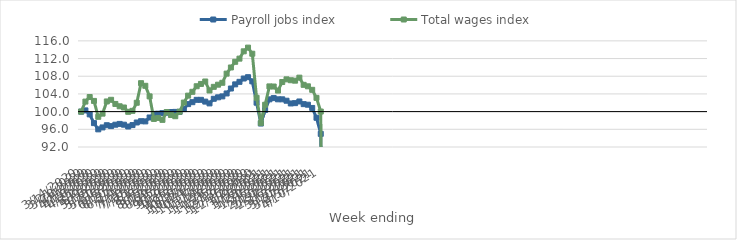
| Category | Payroll jobs index | Total wages index |
|---|---|---|
| 14/03/2020 | 100 | 100 |
| 21/03/2020 | 100.274 | 102.269 |
| 28/03/2020 | 99.375 | 103.298 |
| 04/04/2020 | 97.4 | 102.418 |
| 11/04/2020 | 95.991 | 98.826 |
| 18/04/2020 | 96.426 | 99.545 |
| 25/04/2020 | 96.922 | 102.298 |
| 02/05/2020 | 96.724 | 102.674 |
| 09/05/2020 | 97.038 | 101.734 |
| 16/05/2020 | 97.218 | 101.208 |
| 23/05/2020 | 97.043 | 100.931 |
| 30/05/2020 | 96.633 | 99.958 |
| 06/06/2020 | 96.957 | 100.173 |
| 13/06/2020 | 97.542 | 102.004 |
| 20/06/2020 | 97.833 | 106.428 |
| 27/06/2020 | 97.789 | 105.836 |
| 04/07/2020 | 98.674 | 103.444 |
| 11/07/2020 | 99.492 | 98.348 |
| 18/07/2020 | 99.531 | 98.571 |
| 25/07/2020 | 99.656 | 98.134 |
| 01/08/2020 | 99.757 | 99.898 |
| 08/08/2020 | 99.907 | 99.233 |
| 15/08/2020 | 99.94 | 98.96 |
| 22/08/2020 | 99.945 | 99.984 |
| 29/08/2020 | 100.574 | 102.046 |
| 05/09/2020 | 101.694 | 103.614 |
| 12/09/2020 | 102.133 | 104.478 |
| 19/09/2020 | 102.664 | 105.738 |
| 26/09/2020 | 102.668 | 106.257 |
| 03/10/2020 | 102.264 | 106.81 |
| 10/10/2020 | 101.857 | 104.776 |
| 17/10/2020 | 102.901 | 105.602 |
| 24/10/2020 | 103.231 | 106.091 |
| 31/10/2020 | 103.444 | 106.518 |
| 07/11/2020 | 104.106 | 108.591 |
| 14/11/2020 | 105.22 | 109.98 |
| 21/11/2020 | 106.16 | 111.262 |
| 28/11/2020 | 106.733 | 111.978 |
| 05/12/2020 | 107.48 | 113.634 |
| 12/12/2020 | 107.784 | 114.47 |
| 19/12/2020 | 106.841 | 113.089 |
| 26/12/2020 | 102.022 | 103.13 |
| 02/01/2021 | 97.305 | 97.441 |
| 09/01/2021 | 100.384 | 101.554 |
| 16/01/2021 | 102.771 | 105.7 |
| 23/01/2021 | 103.056 | 105.674 |
| 30/01/2021 | 102.782 | 104.756 |
| 06/02/2021 | 102.779 | 106.689 |
| 13/02/2021 | 102.462 | 107.294 |
| 20/02/2021 | 101.844 | 107.092 |
| 27/02/2021 | 101.918 | 106.997 |
| 06/03/2021 | 102.292 | 107.679 |
| 13/03/2021 | 101.693 | 106.056 |
| 20/03/2021 | 101.56 | 105.72 |
| 27/03/2021 | 100.831 | 104.928 |
| 03/04/2021 | 98.61 | 103.11 |
| 10/04/2021 | 94.971 | 100.014 |